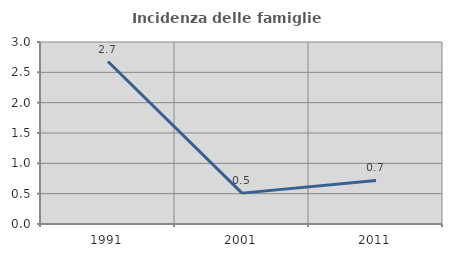
| Category | Incidenza delle famiglie numerose |
|---|---|
| 1991.0 | 2.679 |
| 2001.0 | 0.509 |
| 2011.0 | 0.718 |